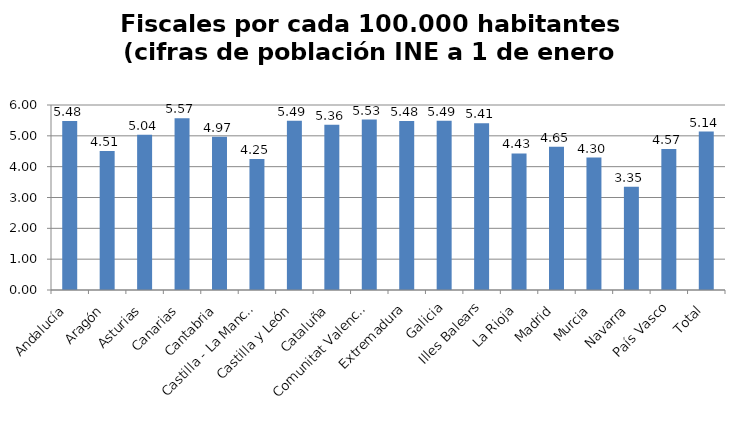
| Category | Fiscales por cada 100.000 habitantes |
|---|---|
| Andalucía | 5.479 |
| Aragón | 4.507 |
| Asturias | 5.035 |
| Canarias | 5.569 |
| Cantabria | 4.969 |
| Castilla - La Mancha | 4.247 |
| Castilla y León | 5.489 |
| Cataluña | 5.358 |
| Comunitat Valenciana | 5.528 |
| Extremadura | 5.482 |
| Galicia | 5.488 |
| Illes Balears | 5.411 |
| La Rioja | 4.428 |
| Madrid | 4.648 |
| Murcia | 4.296 |
| Navarra | 3.345 |
| País Vasco | 4.575 |
| Total | 5.137 |